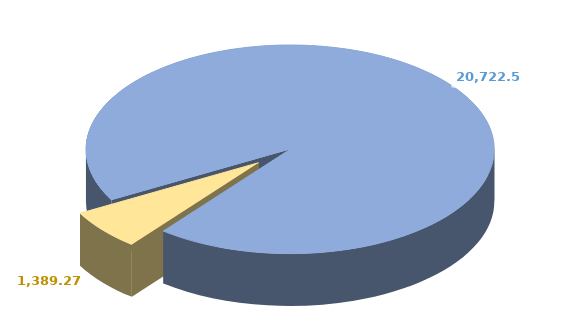
| Category | Series 0 |
|---|---|
| 0 | 20722.568 |
| 1 | 1389.274 |